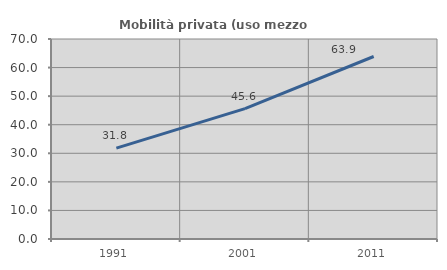
| Category | Mobilità privata (uso mezzo privato) |
|---|---|
| 1991.0 | 31.825 |
| 2001.0 | 45.625 |
| 2011.0 | 63.87 |